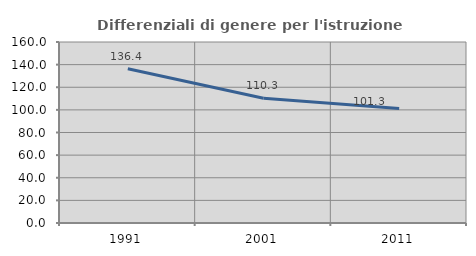
| Category | Differenziali di genere per l'istruzione superiore |
|---|---|
| 1991.0 | 136.354 |
| 2001.0 | 110.328 |
| 2011.0 | 101.31 |